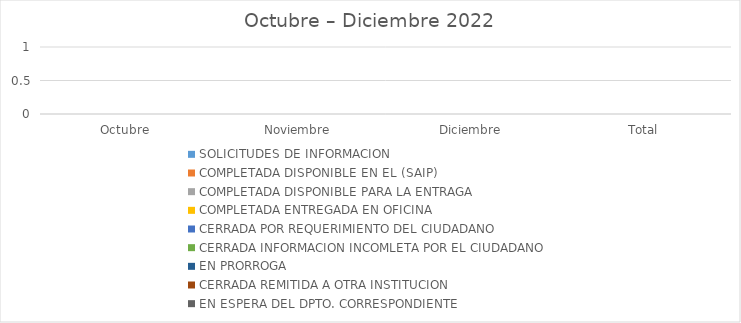
| Category | SOLICITUDES DE INFORMACION | COMPLETADA DISPONIBLE EN EL (SAIP) | COMPLETADA DISPONIBLE PARA LA ENTRAGA | COMPLETADA ENTREGADA EN OFICINA | CERRADA POR REQUERIMIENTO DEL CIUDADANO | CERRADA INFORMACION INCOMLETA POR EL CIUDADANO | EN PRORROGA | CERRADA REMITIDA A OTRA INSTITUCION | EN ESPERA DEL DPTO. CORRESPONDIENTE |
|---|---|---|---|---|---|---|---|---|---|
| Octubre | 0 | 0 | 0 | 0 | 0 | 0 | 0 | 0 | 0 |
| Noviembre | 0 | 0 | 0 | 0 | 0 | 0 | 0 | 0 | 0 |
| Diciembre | 0 | 0 | 0 | 0 | 0 | 0 | 0 | 0 | 0 |
| Total | 0 | 0 | 0 | 0 | 0 | 0 | 0 | 0 | 0 |